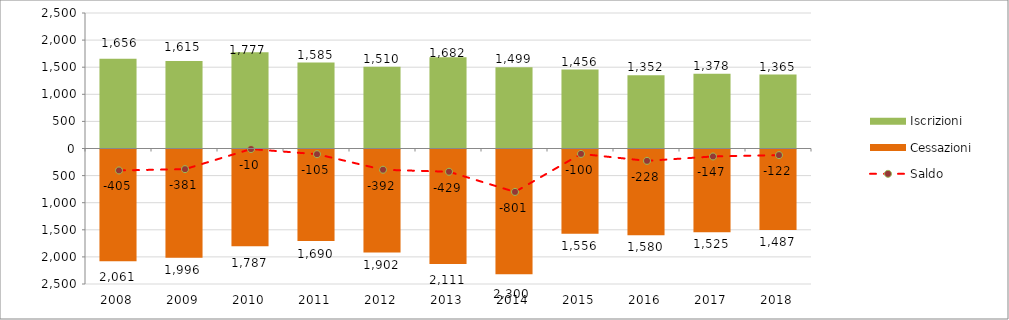
| Category | Iscrizioni | Cessazioni |
|---|---|---|
| 2008.0 | 1656 | -2061 |
| 2009.0 | 1615 | -1996 |
| 2010.0 | 1777 | -1787 |
| 2011.0 | 1585 | -1690 |
| 2012.0 | 1510 | -1902 |
| 2013.0 | 1682 | -2111 |
| 2014.0 | 1499 | -2300 |
| 2015.0 | 1456 | -1556 |
| 2016.0 | 1352 | -1580 |
| 2017.0 | 1378 | -1525 |
| 2018.0 | 1365 | -1487 |